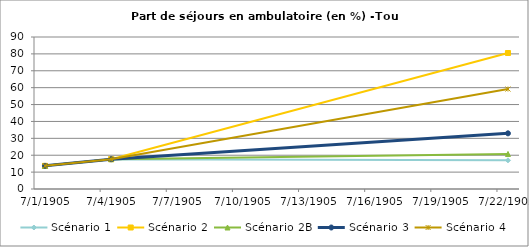
| Category | Scénario 1 | Scénario 2 | Scénario 2B | Scénario 3 | Scénario 4 |
|---|---|---|---|---|---|
| 2009.0 | 13.705 | 13.705 | 13.705 | 13.705 | 13.705 |
| 2012.0 | 17.647 | 17.647 | 17.647 | 17.647 | 17.647 |
| 2030.0 | 16.972 | 80.519 | 20.757 | 32.967 | 59.19 |